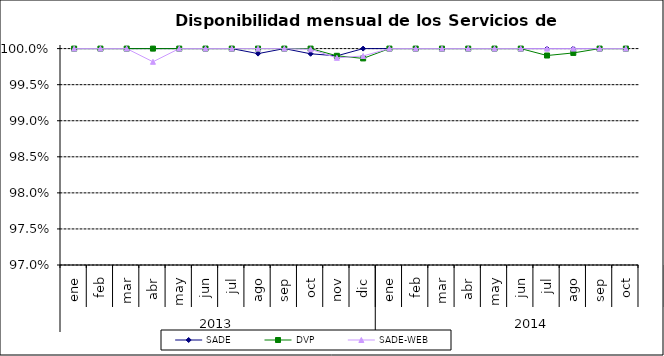
| Category | SADE | DVP | SADE-WEB |
|---|---|---|---|
| 0 | 1 | 1 | 1 |
| 1 | 1 | 1 | 1 |
| 2 | 1 | 1 | 1 |
| 3 | 1 | 1 | 0.998 |
| 4 | 1 | 1 | 1 |
| 5 | 1 | 1 | 1 |
| 6 | 1 | 1 | 1 |
| 7 | 0.999 | 1 | 1 |
| 8 | 1 | 1 | 1 |
| 9 | 0.999 | 1 | 1 |
| 10 | 0.999 | 0.999 | 0.999 |
| 11 | 1 | 0.999 | 0.999 |
| 12 | 1 | 1 | 1 |
| 13 | 1 | 1 | 1 |
| 14 | 1 | 1 | 1 |
| 15 | 1 | 1 | 1 |
| 16 | 1 | 1 | 1 |
| 17 | 1 | 1 | 1 |
| 18 | 1 | 0.999 | 1 |
| 19 | 1 | 0.999 | 1 |
| 20 | 1 | 1 | 1 |
| 21 | 1 | 1 | 1 |